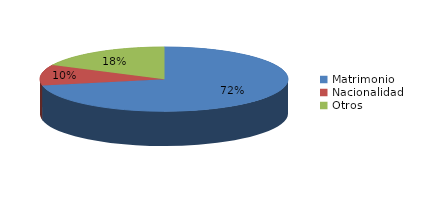
| Category | Series 0 |
|---|---|
| Matrimonio | 1658 |
| Nacionalidad | 239 |
| Otros | 411 |